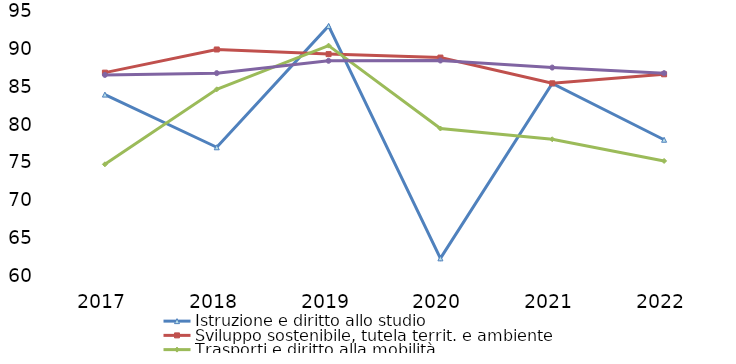
| Category | Istruzione e diritto allo studio | Sviluppo sostenibile, tutela territ. e ambiente | Trasporti e diritto alla mobilità | Diritti sociali, politiche sociali e famiglia |
|---|---|---|---|---|
| 2017.0 | 83.96 | 86.86 | 74.75 | 86.56 |
| 2018.0 | 76.999 | 89.919 | 84.658 | 86.794 |
| 2019.0 | 93.024 | 89.305 | 90.426 | 88.426 |
| 2020.0 | 62.33 | 88.85 | 79.48 | 88.46 |
| 2021.0 | 85.43 | 85.45 | 78.06 | 87.53 |
| 2022.0 | 77.994 | 86.642 | 75.197 | 86.789 |